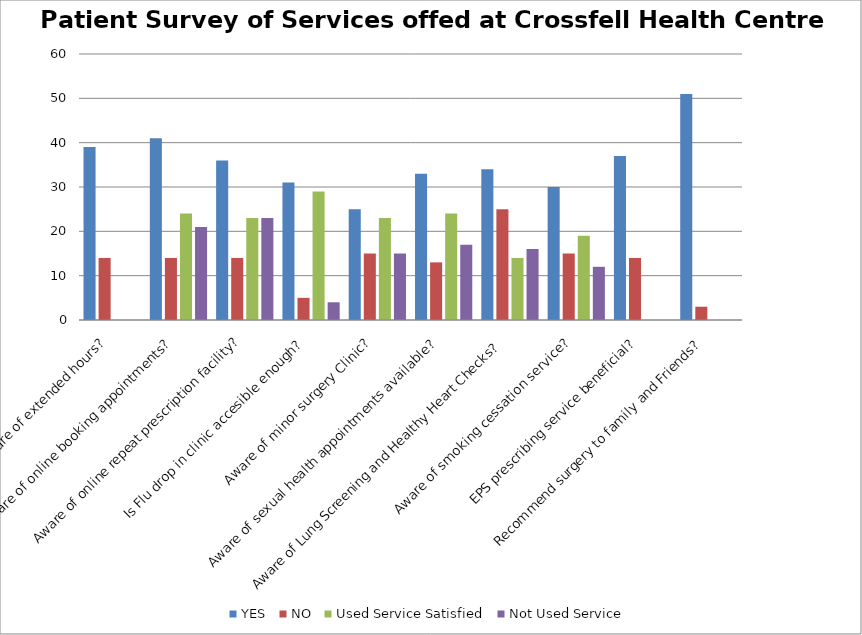
| Category | YES | NO | Used Service Satisfied | Not Used Service |
|---|---|---|---|---|
| Aware of extended hours? | 39 | 14 | 0 | 0 |
| aware of online booking appointments? | 41 | 14 | 24 | 21 |
| Aware of online repeat prescription facility? | 36 | 14 | 23 | 23 |
| Is Flu drop in clinic accesible enough? | 31 | 5 | 29 | 4 |
| Aware of minor surgery Clinic? | 25 | 15 | 23 | 15 |
| Aware of sexual health appointments available? | 33 | 13 | 24 | 17 |
| Aware of Lung Screening and Healthy Heart Checks? | 34 | 25 | 14 | 16 |
| Aware of smoking cessation service? | 30 | 15 | 19 | 12 |
| EPS prescribing service beneficial? | 37 | 14 | 0 | 0 |
| Recommend surgery to family and Friends? | 51 | 3 | 0 | 0 |